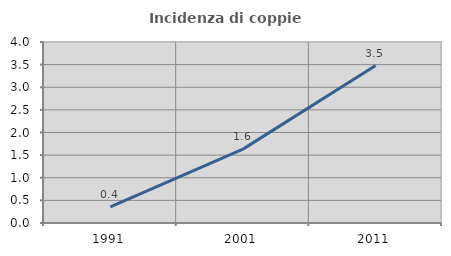
| Category | Incidenza di coppie miste |
|---|---|
| 1991.0 | 0.359 |
| 2001.0 | 1.633 |
| 2011.0 | 3.48 |